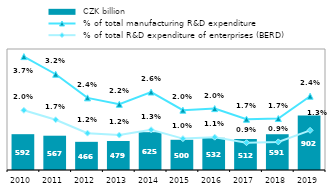
| Category |  CZK billion |
|---|---|
| 2010.0 | 592.056 |
| 2011.0 | 566.742 |
| 2012.0 | 465.578 |
| 2013.0 | 479.388 |
| 2014.0 | 625.195 |
| 2015.0 | 499.552 |
| 2016.0 | 531.732 |
| 2017.0 | 512.334 |
| 2018.0 | 591.173 |
| 2019.0 | 901.621 |